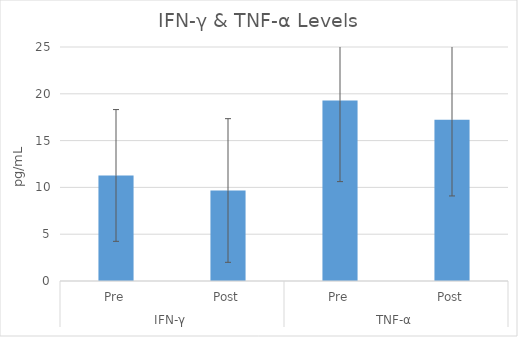
| Category | Series 0 |
|---|---|
| 0 | 11.276 |
| 1 | 9.669 |
| 2 | 19.288 |
| 3 | 17.237 |